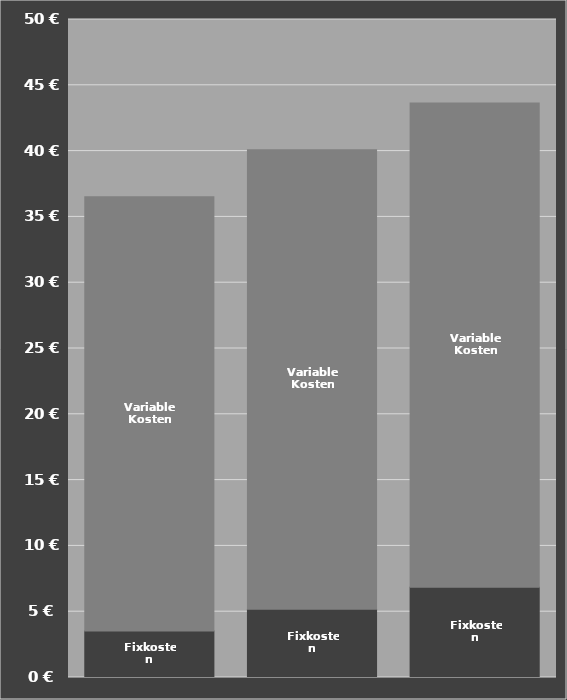
| Category | Fixkosten | Variable Kosten |
|---|---|---|
| Trecker 50 PS | 3.535 | 33 |
| Trecker 75 PS | 5.195 | 34.9 |
| Trecker 100 PS | 6.855 | 36.8 |